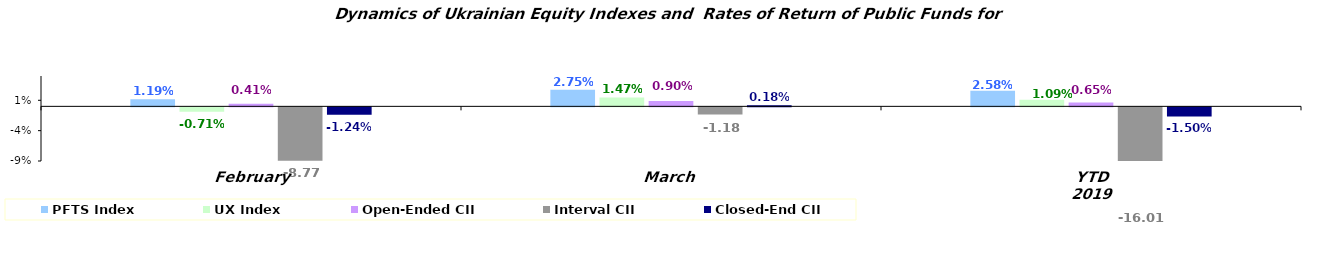
| Category | PFTS Index | UX Index | Open-Ended CII | Interval CII | Closed-End CII |
|---|---|---|---|---|---|
| February | 0.012 | -0.007 | 0.004 | -0.088 | -0.012 |
| March | 0.028 | 0.015 | 0.009 | -0.012 | 0.002 |
| YTD 2019 | 0.026 | 0.011 | 0.007 | -0.16 | -0.015 |